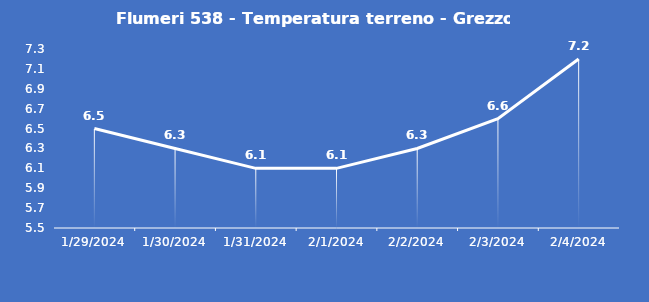
| Category | Flumeri 538 - Temperatura terreno - Grezzo (°C) |
|---|---|
| 1/29/24 | 6.5 |
| 1/30/24 | 6.3 |
| 1/31/24 | 6.1 |
| 2/1/24 | 6.1 |
| 2/2/24 | 6.3 |
| 2/3/24 | 6.6 |
| 2/4/24 | 7.2 |